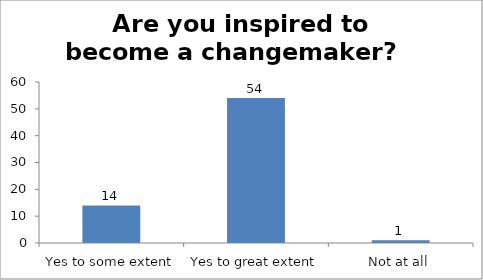
| Category | Are you inspired to become a changemaker?   |
|---|---|
| Yes to some extent | 14 |
| Yes to great extent | 54 |
| Not at all | 1 |